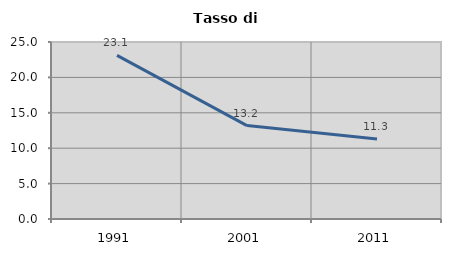
| Category | Tasso di disoccupazione   |
|---|---|
| 1991.0 | 23.118 |
| 2001.0 | 13.198 |
| 2011.0 | 11.304 |